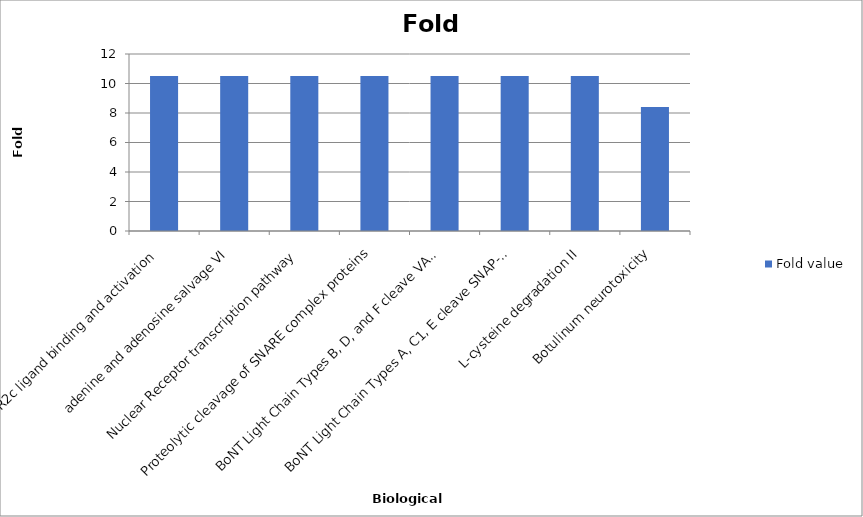
| Category | Fold value |
|---|---|
| FGFR2c ligand binding and activation | 10.502 |
| adenine and adenosine salvage VI | 10.502 |
| Nuclear Receptor transcription pathway | 10.502 |
| Proteolytic cleavage of SNARE complex proteins | 10.502 |
| BoNT Light Chain Types B, D, and F cleave VAMP/Synaptobrevin | 10.502 |
| BoNT Light Chain Types A, C1, E cleave SNAP-25 | 10.502 |
| L-cysteine degradation II | 10.502 |
| Botulinum neurotoxicity | 8.406 |